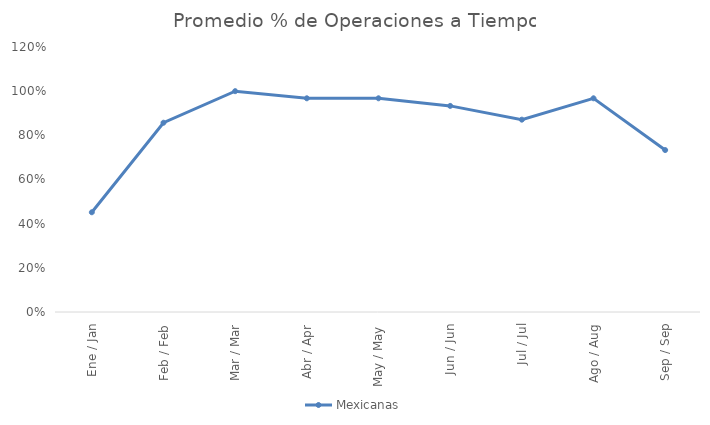
| Category | Mexicanas |
|---|---|
| Ene / Jan | 0.452 |
| Feb / Feb | 0.857 |
| Mar / Mar | 1 |
| Abr / Apr | 0.968 |
| May / May | 0.968 |
| Jun / Jun | 0.933 |
| Jul / Jul | 0.871 |
| Ago / Aug | 0.968 |
| Sep / Sep | 0.733 |